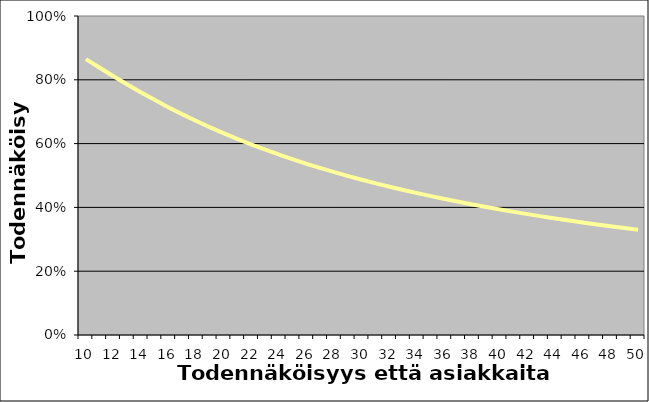
| Category | Series 1 |
|---|---|
| 10.0 | 0.865 |
| 11.0 | 0.838 |
| 12.0 | 0.811 |
| 13.0 | 0.785 |
| 14.0 | 0.76 |
| 15.0 | 0.736 |
| 16.0 | 0.713 |
| 17.0 | 0.692 |
| 18.0 | 0.671 |
| 19.0 | 0.651 |
| 20.0 | 0.632 |
| 21.0 | 0.614 |
| 22.0 | 0.597 |
| 23.0 | 0.581 |
| 24.0 | 0.565 |
| 25.0 | 0.551 |
| 26.0 | 0.537 |
| 27.0 | 0.523 |
| 28.0 | 0.51 |
| 29.0 | 0.498 |
| 30.0 | 0.487 |
| 31.0 | 0.475 |
| 32.0 | 0.465 |
| 33.0 | 0.455 |
| 34.0 | 0.445 |
| 35.0 | 0.435 |
| 36.0 | 0.426 |
| 37.0 | 0.418 |
| 38.0 | 0.409 |
| 39.0 | 0.401 |
| 40.0 | 0.393 |
| 41.0 | 0.386 |
| 42.0 | 0.379 |
| 43.0 | 0.372 |
| 44.0 | 0.365 |
| 45.0 | 0.359 |
| 46.0 | 0.353 |
| 47.0 | 0.347 |
| 48.0 | 0.341 |
| 49.0 | 0.335 |
| 50.0 | 0.33 |